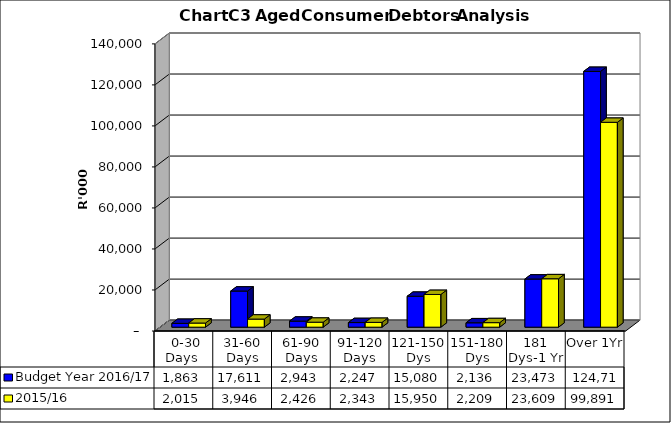
| Category | Budget Year 2016/17 | 2015/16 |
|---|---|---|
|  0-30 Days  | 1863019.94 | 2015206.36 |
| 31-60 Days | 17610728.35 | 3945667.02 |
| 61-90 Days | 2943271.83 | 2426116.66 |
| 91-120 Days | 2246629.15 | 2342981.15 |
| 121-150 Dys | 15079950.92 | 15950144.33 |
| 151-180 Dys | 2135762.15 | 2209137.93 |
| 181 Dys-1 Yr | 23472796.36 | 23608731.53 |
| Over 1Yr | 124717730.92 | 99890553.21 |